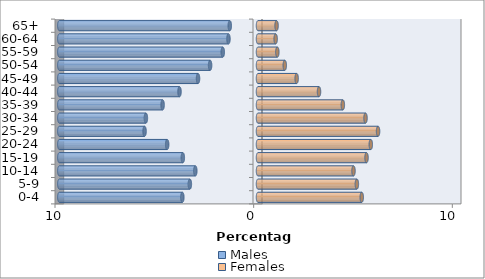
| Category | Males | Females |
|---|---|---|
| 0-4 | -3.808 | 5.222 |
| 5-9 | -3.43 | 4.977 |
| 10-14 | -3.155 | 4.807 |
| 15-19 | -3.784 | 5.463 |
| 20-24 | -4.572 | 5.678 |
| 25-29 | -5.71 | 6.044 |
| 30-34 | -5.643 | 5.412 |
| 35-39 | -4.802 | 4.27 |
| 40-44 | -3.951 | 3.071 |
| 45-49 | -3.019 | 1.945 |
| 50-54 | -2.411 | 1.347 |
| 55-59 | -1.773 | 0.973 |
| 60-64 | -1.487 | 0.889 |
| 65+ | -1.42 | 0.934 |